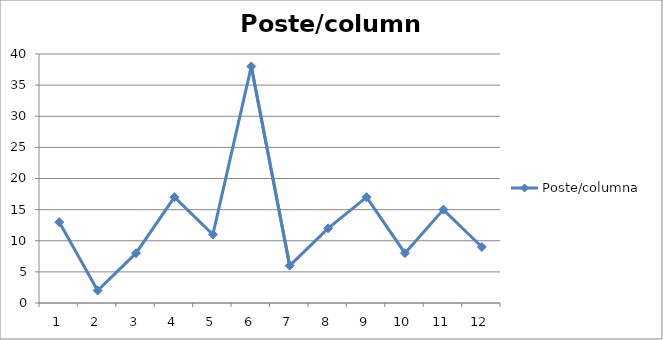
| Category | Poste/columna  |
|---|---|
| 0 | 13 |
| 1 | 2 |
| 2 | 8 |
| 3 | 17 |
| 4 | 11 |
| 5 | 38 |
| 6 | 6 |
| 7 | 12 |
| 8 | 17 |
| 9 | 8 |
| 10 | 15 |
| 11 | 9 |